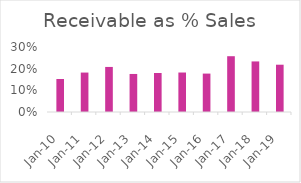
| Category | % Sales |
|---|---|
| 2010-03-31 | 0.152 |
| 2011-03-31 | 0.182 |
| 2012-03-31 | 0.208 |
| 2013-03-31 | 0.176 |
| 2014-03-31 | 0.18 |
| 2015-03-31 | 0.182 |
| 2016-03-31 | 0.177 |
| 2017-03-31 | 0.257 |
| 2018-03-31 | 0.233 |
| 2019-03-31 | 0.218 |